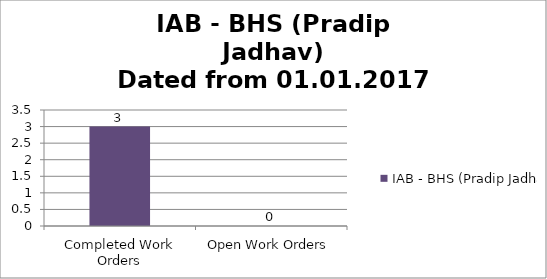
| Category | IAB - BHS (Pradip Jadhav) |
|---|---|
| Completed Work Orders | 3 |
| Open Work Orders | 0 |